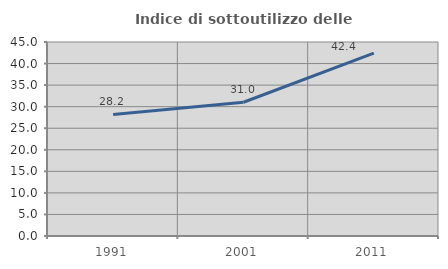
| Category | Indice di sottoutilizzo delle abitazioni  |
|---|---|
| 1991.0 | 28.185 |
| 2001.0 | 31.022 |
| 2011.0 | 42.407 |